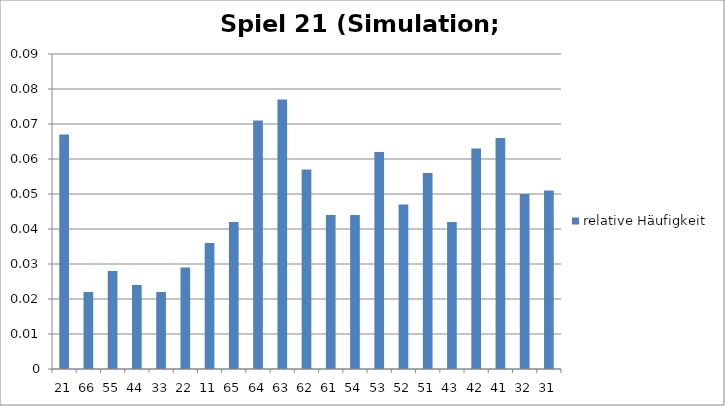
| Category | relative Häufigkeit |
|---|---|
| 21.0 | 0.067 |
| 66.0 | 0.022 |
| 55.0 | 0.028 |
| 44.0 | 0.024 |
| 33.0 | 0.022 |
| 22.0 | 0.029 |
| 11.0 | 0.036 |
| 65.0 | 0.042 |
| 64.0 | 0.071 |
| 63.0 | 0.077 |
| 62.0 | 0.057 |
| 61.0 | 0.044 |
| 54.0 | 0.044 |
| 53.0 | 0.062 |
| 52.0 | 0.047 |
| 51.0 | 0.056 |
| 43.0 | 0.042 |
| 42.0 | 0.063 |
| 41.0 | 0.066 |
| 32.0 | 0.05 |
| 31.0 | 0.051 |